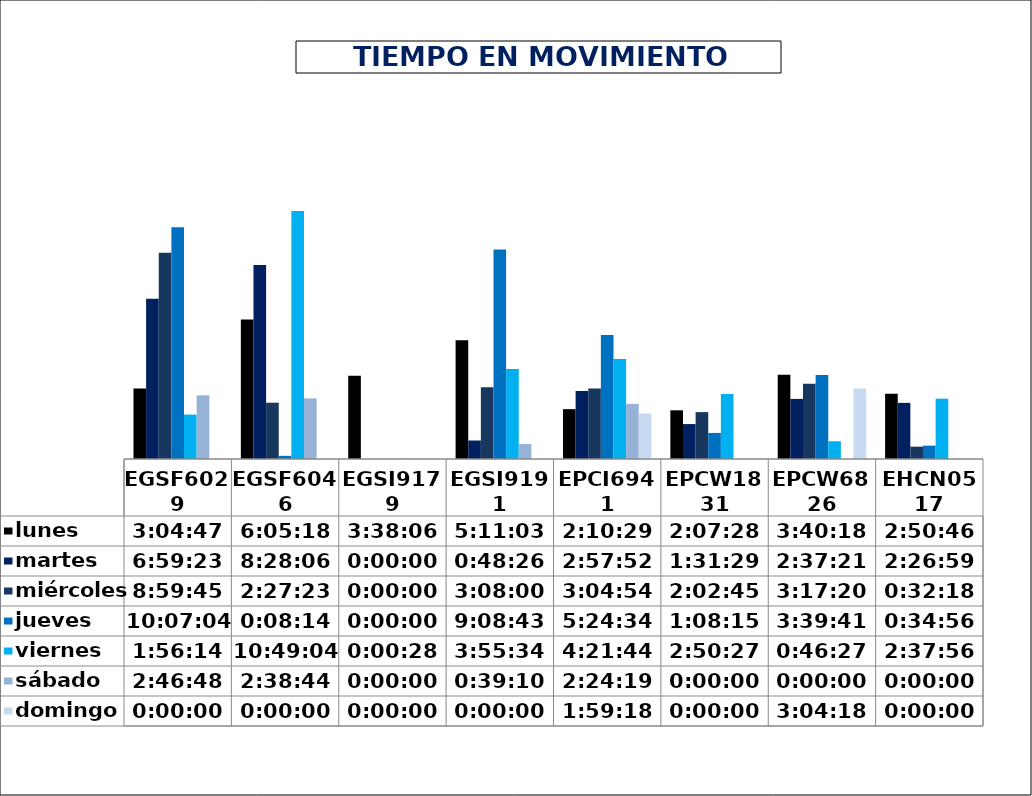
| Category | lunes | martes | miércoles | jueves | viernes | sábado | domingo |
|---|---|---|---|---|---|---|---|
| EGSF6029 | 0.128 | 0.291 | 0.375 | 0.422 | 0.081 | 0.116 | 0 |
| EGSF6046 | 0.254 | 0.353 | 0.102 | 0.006 | 0.451 | 0.11 | 0 |
| EGSI9179 | 0.151 | 0 | 0 | 0 | 0 | 0 | 0 |
| EGSI9191 | 0.216 | 0.034 | 0.131 | 0.381 | 0.164 | 0.027 | 0 |
| EPCI6941 | 0.091 | 0.124 | 0.128 | 0.225 | 0.182 | 0.1 | 0.083 |
| EPCW1831 | 0.089 | 0.064 | 0.085 | 0.047 | 0.118 | 0 | 0 |
| EPCW6826 | 0.153 | 0.109 | 0.137 | 0.153 | 0.032 | 0 | 0.128 |
| EHCN0517 | 0.119 | 0.102 | 0.022 | 0.024 | 0.11 | 0 | 0 |